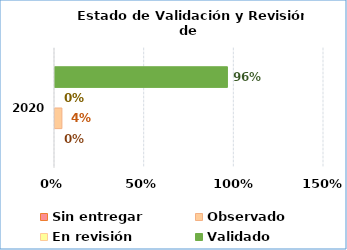
| Category | Sin entregar | Observado | En revisión | Validado |
|---|---|---|---|---|
| 0 | 0 | 0.038 | 0 | 0.962 |